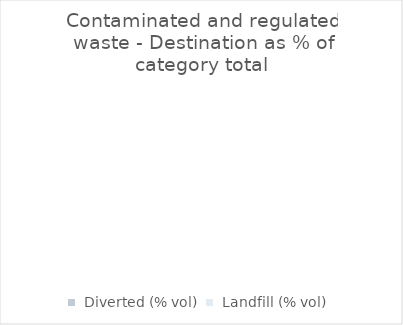
| Category |  Contam. and Reg. Waste  |
|---|---|
|  Diverted (% vol)  | 0 |
|  Landfill (% vol)  | 0 |